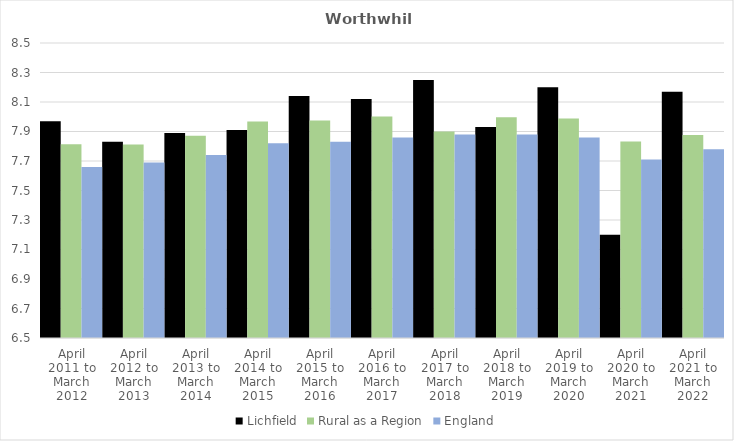
| Category | Lichfield | Rural as a Region | England |
|---|---|---|---|
| April 2011 to March 2012 | 7.97 | 7.813 | 7.66 |
| April 2012 to March 2013 | 7.83 | 7.811 | 7.69 |
| April 2013 to March 2014 | 7.89 | 7.871 | 7.74 |
| April 2014 to March 2015 | 7.91 | 7.967 | 7.82 |
| April 2015 to March 2016 | 8.14 | 7.975 | 7.83 |
| April 2016 to March 2017 | 8.12 | 8.002 | 7.86 |
| April 2017 to March 2018 | 8.25 | 7.9 | 7.88 |
| April 2018 to March 2019 | 7.93 | 7.996 | 7.88 |
| April 2019 to March 2020 | 8.2 | 7.988 | 7.86 |
| April 2020 to March 2021 | 7.2 | 7.831 | 7.71 |
| April 2021 to March 2022 | 8.17 | 7.877 | 7.78 |